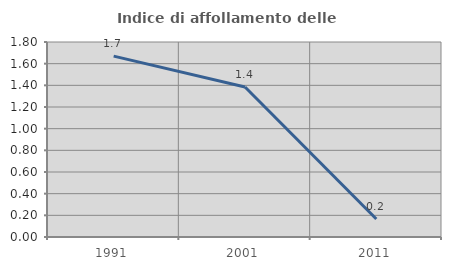
| Category | Indice di affollamento delle abitazioni  |
|---|---|
| 1991.0 | 1.67 |
| 2001.0 | 1.384 |
| 2011.0 | 0.166 |